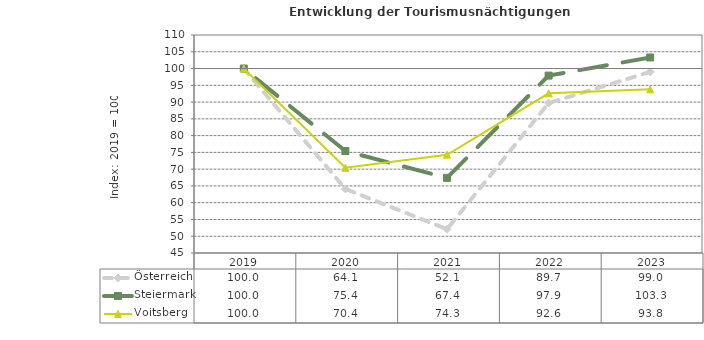
| Category | Österreich | Steiermark | Voitsberg |
|---|---|---|---|
| 2023.0 | 99 | 103.3 | 93.8 |
| 2022.0 | 89.7 | 97.9 | 92.6 |
| 2021.0 | 52.1 | 67.4 | 74.3 |
| 2020.0 | 64.1 | 75.4 | 70.4 |
| 2019.0 | 100 | 100 | 100 |